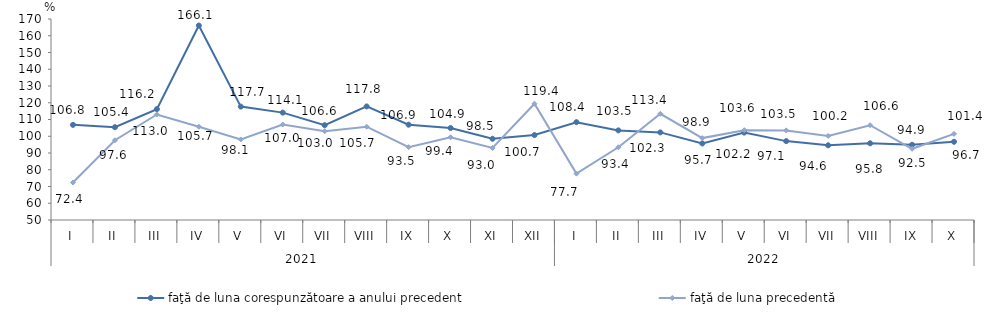
| Category | faţă de luna corespunzătoare a anului precedent | faţă de luna precedentă   |
|---|---|---|
| 0 | 106.8 | 72.4 |
| 1 | 105.4 | 97.6 |
| 2 | 116.2 | 113 |
| 3 | 166.1 | 105.7 |
| 4 | 117.7 | 98.1 |
| 5 | 114.1 | 107 |
| 6 | 106.6 | 103 |
| 7 | 117.8 | 105.7 |
| 8 | 106.9 | 93.5 |
| 9 | 104.9 | 99.4 |
| 10 | 98.5 | 93 |
| 11 | 100.7 | 119.4 |
| 12 | 108.4 | 77.7 |
| 13 | 103.5 | 93.4 |
| 14 | 102.3 | 113.4 |
| 15 | 95.7 | 98.9 |
| 16 | 102.2 | 103.6 |
| 17 | 97.1 | 103.5 |
| 18 | 94.6 | 100.2 |
| 19 | 95.8 | 106.6 |
| 20 | 94.9 | 92.5 |
| 21 | 96.7 | 101.4 |